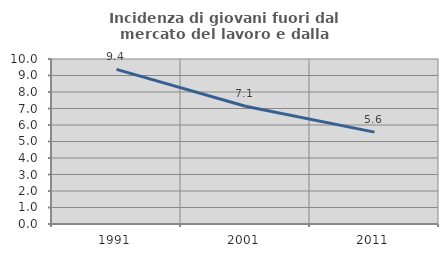
| Category | Incidenza di giovani fuori dal mercato del lavoro e dalla formazione  |
|---|---|
| 1991.0 | 9.37 |
| 2001.0 | 7.135 |
| 2011.0 | 5.57 |